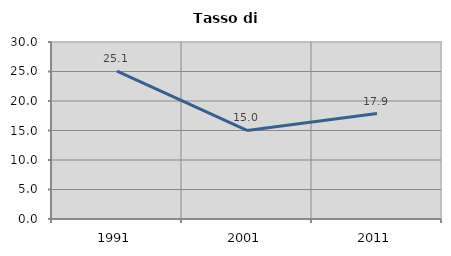
| Category | Tasso di disoccupazione   |
|---|---|
| 1991.0 | 25.072 |
| 2001.0 | 15.018 |
| 2011.0 | 17.863 |